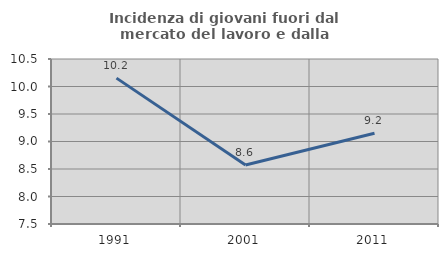
| Category | Incidenza di giovani fuori dal mercato del lavoro e dalla formazione  |
|---|---|
| 1991.0 | 10.152 |
| 2001.0 | 8.571 |
| 2011.0 | 9.15 |